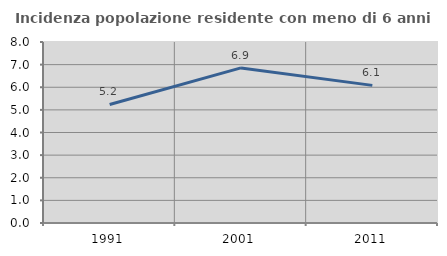
| Category | Incidenza popolazione residente con meno di 6 anni |
|---|---|
| 1991.0 | 5.239 |
| 2001.0 | 6.854 |
| 2011.0 | 6.083 |